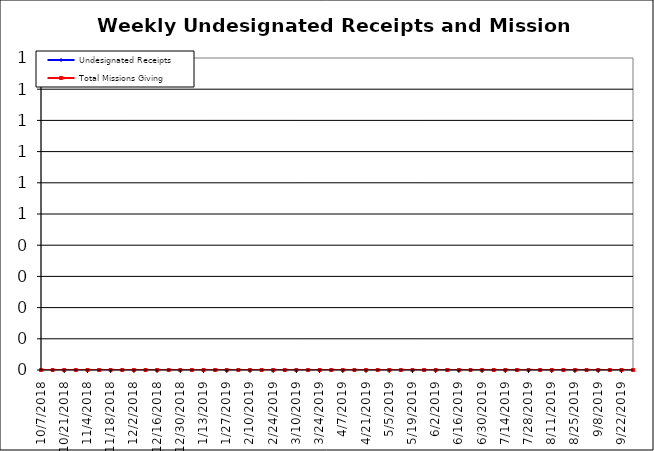
| Category | Undesignated Receipts | Total Missions Giving |
|---|---|---|
| 10/7/18 | 0 | 0 |
| 10/14/18 | 0 | 0 |
| 10/21/18 | 0 | 0 |
| 10/28/18 | 0 | 0 |
| 11/4/18 | 0 | 0 |
| 11/11/18 | 0 | 0 |
| 11/18/18 | 0 | 0 |
| 11/25/18 | 0 | 0 |
| 12/2/18 | 0 | 0 |
| 12/9/18 | 0 | 0 |
| 12/16/18 | 0 | 0 |
| 12/23/18 | 0 | 0 |
| 12/30/18 | 0 | 0 |
| 1/6/19 | 0 | 0 |
| 1/13/19 | 0 | 0 |
| 1/20/19 | 0 | 0 |
| 1/27/19 | 0 | 0 |
| 2/3/19 | 0 | 0 |
| 2/10/19 | 0 | 0 |
| 2/17/19 | 0 | 0 |
| 2/24/19 | 0 | 0 |
| 3/3/19 | 0 | 0 |
| 3/10/19 | 0 | 0 |
| 3/17/19 | 0 | 0 |
| 3/24/19 | 0 | 0 |
| 3/31/19 | 0 | 0 |
| 4/7/19 | 0 | 0 |
| 4/14/19 | 0 | 0 |
| 4/21/19 | 0 | 0 |
| 4/28/19 | 0 | 0 |
| 5/5/19 | 0 | 0 |
| 5/12/19 | 0 | 0 |
| 5/19/19 | 0 | 0 |
| 5/26/19 | 0 | 0 |
| 6/2/19 | 0 | 0 |
| 6/9/19 | 0 | 0 |
| 6/16/19 | 0 | 0 |
| 6/23/19 | 0 | 0 |
| 6/30/19 | 0 | 0 |
| 7/7/19 | 0 | 0 |
| 7/14/19 | 0 | 0 |
| 7/21/19 | 0 | 0 |
| 7/28/19 | 0 | 0 |
| 8/4/19 | 0 | 0 |
| 8/11/19 | 0 | 0 |
| 8/18/19 | 0 | 0 |
| 8/25/19 | 0 | 0 |
| 9/1/19 | 0 | 0 |
| 9/8/19 | 0 | 0 |
| 9/15/19 | 0 | 0 |
| 9/22/19 | 0 | 0 |
| 9/29/19 | 0 | 0 |